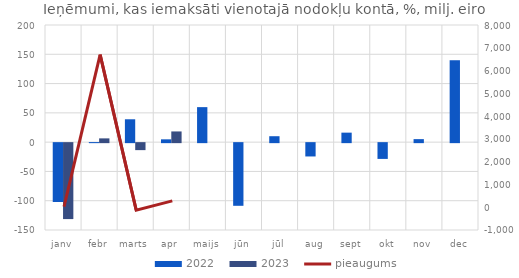
| Category | 2022 | 2023 |
|---|---|---|
| janv | -100.506 | -129.655 |
| febr | 0.095 | 6.432 |
| marts | 39.035 | -11.924 |
| apr | 4.799 | 18.271 |
| maijs | 59.771 | 0 |
| jūn | -106.986 | 0 |
| jūl | 10.122 | 0 |
| aug | -22.738 | 0 |
| sept | 16.213 | 0 |
| okt | -26.931 | 0 |
| nov | 5.139 | 0 |
| dec | 139.842 | 0 |